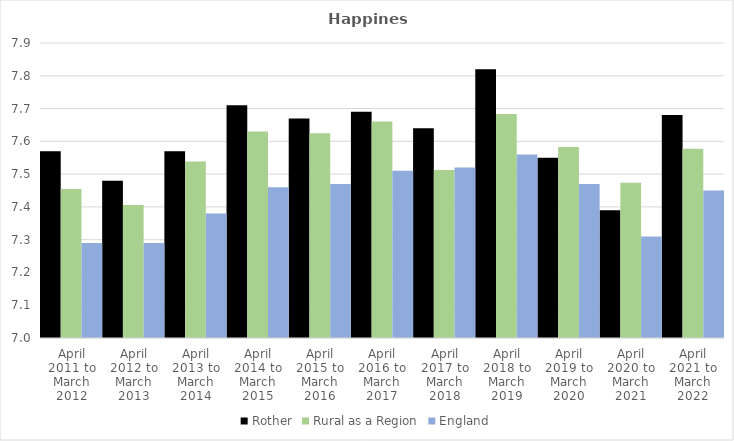
| Category | Rother | Rural as a Region | England |
|---|---|---|---|
| April 2011 to March 2012 | 7.57 | 7.454 | 7.29 |
| April 2012 to March 2013 | 7.48 | 7.406 | 7.29 |
| April 2013 to March 2014 | 7.57 | 7.539 | 7.38 |
| April 2014 to March 2015 | 7.71 | 7.63 | 7.46 |
| April 2015 to March 2016 | 7.67 | 7.625 | 7.47 |
| April 2016 to March 2017 | 7.69 | 7.661 | 7.51 |
| April 2017 to March 2018 | 7.64 | 7.513 | 7.52 |
| April 2018 to March 2019 | 7.82 | 7.684 | 7.56 |
| April 2019 to March 2020 | 7.55 | 7.582 | 7.47 |
| April 2020 to March 2021 | 7.39 | 7.474 | 7.31 |
| April 2021 to March 2022 | 7.68 | 7.577 | 7.45 |